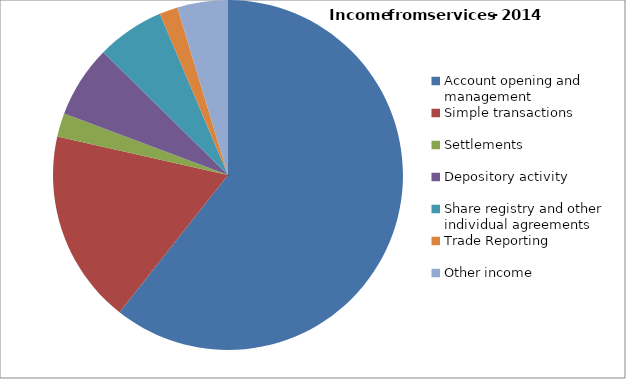
| Category | Series 0 |
|---|---|
| Account opening and management | 0.606 |
| Simple transactions | 0.179 |
| Settlements | 0.022 |
| Depository activity | 0.067 |
| Share registry and other individual agreements | 0.063 |
| Trade Reporting | 0.017 |
| Other income | 0.047 |